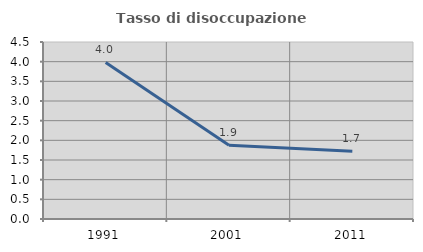
| Category | Tasso di disoccupazione giovanile  |
|---|---|
| 1991.0 | 3.98 |
| 2001.0 | 1.875 |
| 2011.0 | 1.724 |